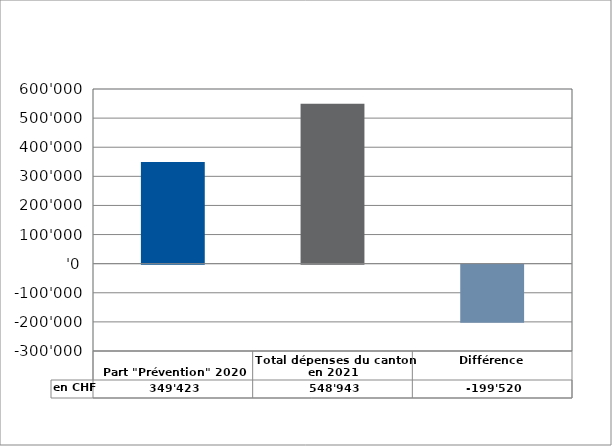
| Category | en CHF |
|---|---|
| 
Part "Prévention" 2020

 | 349423 |
| Total dépenses du canton en 2021 | 548943 |
| Différence | -199520 |